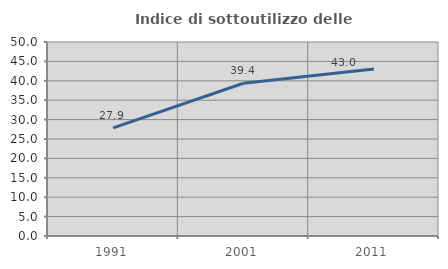
| Category | Indice di sottoutilizzo delle abitazioni  |
|---|---|
| 1991.0 | 27.853 |
| 2001.0 | 39.358 |
| 2011.0 | 43.025 |